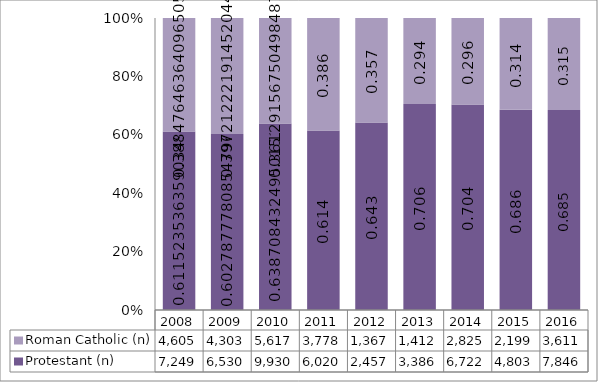
| Category | Protestant (n) | Roman Catholic (n) |
|---|---|---|
| 2008.0 | 7249 | 4605 |
| 2009.0 | 6530 | 4303 |
| 2010.0 | 9930 | 5617 |
| 2011.0 | 6020 | 3778 |
| 2012.0 | 2457 | 1367 |
| 2013.0 | 3386 | 1412 |
| 2014.0 | 6722 | 2825 |
| 2015.0 | 4803 | 2199 |
| 2016.0 | 7846 | 3611 |